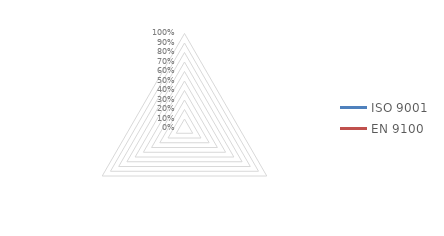
| Category | ISO 9001 | EN 9100 |
|---|---|---|
| Article 10.1  : Généralités | 0 | 0 |
| Article 10.2  : Non-conformité et action corrective | 0 | 0 |
| Article 10.3  : Amélioration continue | 0 | 0 |